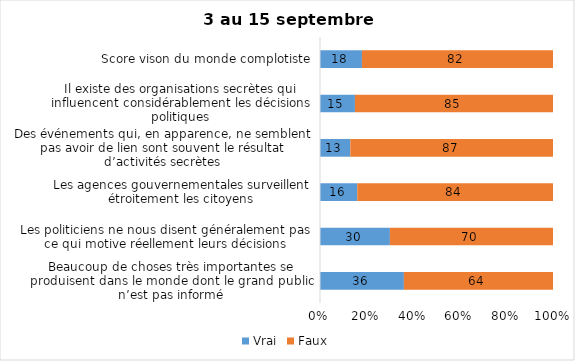
| Category | Vrai | Faux |
|---|---|---|
| Beaucoup de choses très importantes se produisent dans le monde dont le grand public n’est pas informé | 36 | 64 |
| Les politiciens ne nous disent généralement pas ce qui motive réellement leurs décisions | 30 | 70 |
| Les agences gouvernementales surveillent étroitement les citoyens | 16 | 84 |
| Des événements qui, en apparence, ne semblent pas avoir de lien sont souvent le résultat d’activités secrètes | 13 | 87 |
| Il existe des organisations secrètes qui influencent considérablement les décisions politiques | 15 | 85 |
| Score vison du monde complotiste | 18 | 82 |